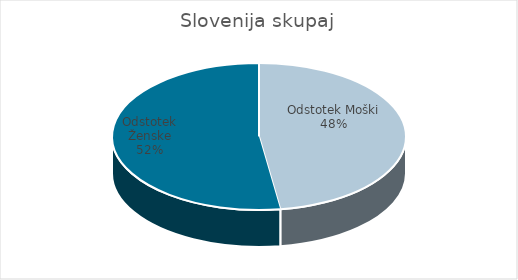
| Category | Slovenija skupaj |
|---|---|
| Odstotek Moški | 25.28 |
| Odstotek Ženske | 27.73 |